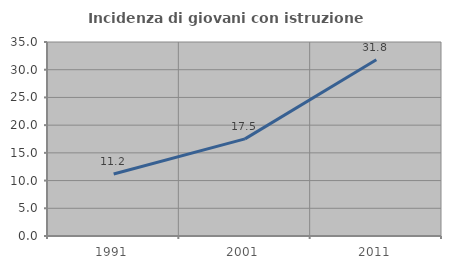
| Category | Incidenza di giovani con istruzione universitaria |
|---|---|
| 1991.0 | 11.188 |
| 2001.0 | 17.529 |
| 2011.0 | 31.787 |